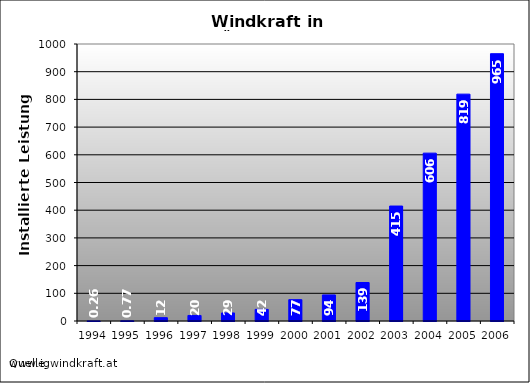
| Category | Series 1 |
|---|---|
| 1994.0 | 0.26 |
| 1995.0 | 0.77 |
| 1996.0 | 12 |
| 1997.0 | 20 |
| 1998.0 | 29 |
| 1999.0 | 42 |
| 2000.0 | 77 |
| 2001.0 | 94 |
| 2002.0 | 139 |
| 2003.0 | 415 |
| 2004.0 | 606 |
| 2005.0 | 819 |
| 2006.0 | 965 |